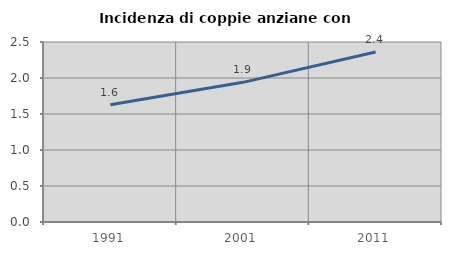
| Category | Incidenza di coppie anziane con figli |
|---|---|
| 1991.0 | 1.628 |
| 2001.0 | 1.94 |
| 2011.0 | 2.362 |